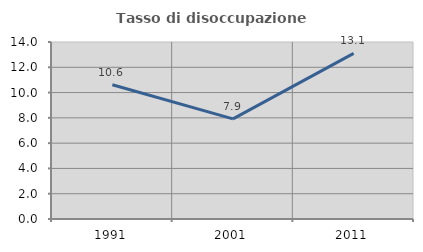
| Category | Tasso di disoccupazione giovanile  |
|---|---|
| 1991.0 | 10.615 |
| 2001.0 | 7.921 |
| 2011.0 | 13.095 |